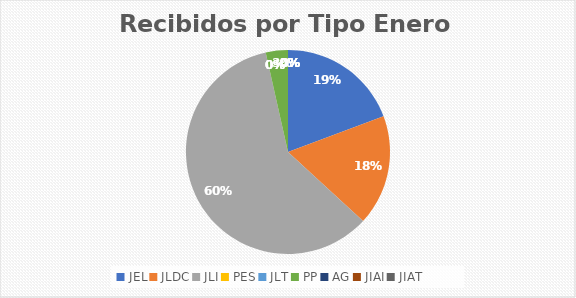
| Category | Series 0 |
|---|---|
| JEL | 11 |
| JLDC | 10 |
| JLI | 34 |
| PES | 0 |
| JLT | 0 |
| PP | 2 |
| AG | 0 |
| JIAI | 0 |
| JIAT | 0 |